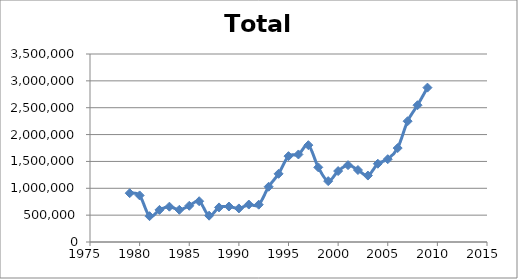
| Category | Total |
|---|---|
| 1979.0 | 908820 |
| 1980.0 | 867110 |
| 1981.0 | 480709 |
| 1982.0 | 598009 |
| 1983.0 | 657946 |
| 1984.0 | 599018 |
| 1985.0 | 674206 |
| 1986.0 | 758965 |
| 1987.0 | 489873 |
| 1988.0 | 643794 |
| 1989.0 | 660350 |
| 1990.0 | 624851 |
| 1991.0 | 697240 |
| 1992.0 | 694430 |
| 1993.0 | 1028833 |
| 1994.0 | 1269319 |
| 1995.0 | 1598380 |
| 1996.0 | 1629615 |
| 1997.0 | 1802808 |
| 1998.0 | 1389958 |
| 1999.0 | 1133176 |
| 2000.0 | 1320771 |
| 2001.0 | 1430755 |
| 2002.0 | 1339924 |
| 2003.0 | 1237021 |
| 2004.0 | 1457273 |
| 2005.0 | 1541465 |
| 2006.0 | 1748758 |
| 2007.0 | 2248857 |
| 2008.0 | 2546352 |
| 2009.0 | 2874077 |